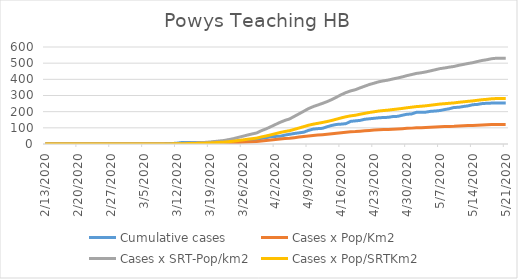
| Category | Cumulative cases | Cases x Pop/Km2 | Cases x SRT-Pop/km2 | Cases x Pop/SRTKm2 |
|---|---|---|---|---|
| 5/21/20 | 253 | 121.25 | 530.532 | 281.176 |
| 5/20/20 | 253 | 121.25 | 530.532 | 281.176 |
| 5/19/20 | 253 | 121.221 | 530.407 | 281.109 |
| 5/18/20 | 253 | 120.556 | 527.499 | 279.568 |
| 5/17/20 | 252 | 119.142 | 521.309 | 276.288 |
| 5/16/20 | 250 | 118.088 | 516.698 | 273.844 |
| 5/15/20 | 245 | 116.607 | 510.218 | 270.409 |
| 5/14/20 | 243 | 114.964 | 503.031 | 266.6 |
| 5/13/20 | 236 | 113.825 | 498.046 | 263.958 |
| 5/12/20 | 232 | 112.515 | 492.313 | 260.92 |
| 5/11/20 | 227 | 111.214 | 486.622 | 257.904 |
| 5/10/20 | 226 | 109.6 | 479.56 | 254.161 |
| 5/9/20 | 218 | 108.66 | 475.447 | 251.981 |
| 5/8/20 | 213 | 107.483 | 470.296 | 249.251 |
| 5/7/20 | 207 | 106.534 | 466.142 | 247.05 |
| 5/6/20 | 204 | 104.967 | 459.287 | 243.417 |
| 5/5/20 | 202 | 103.401 | 452.433 | 239.784 |
| 5/4/20 | 197 | 101.891 | 445.828 | 236.283 |
| 5/3/20 | 196 | 100.676 | 440.51 | 233.465 |
| 5/2/20 | 196 | 99.783 | 436.605 | 231.396 |
| 5/1/20 | 186 | 98.198 | 429.668 | 227.719 |
| 4/30/20 | 184 | 96.698 | 423.104 | 224.24 |
| 4/29/20 | 178 | 94.875 | 415.128 | 220.013 |
| 4/28/20 | 171 | 93.327 | 408.357 | 216.424 |
| 4/27/20 | 170 | 91.941 | 402.292 | 213.21 |
| 4/26/20 | 165 | 90.384 | 395.479 | 209.599 |
| 4/25/20 | 164 | 89.254 | 390.535 | 206.979 |
| 4/24/20 | 162 | 87.973 | 384.927 | 204.007 |
| 4/23/20 | 159 | 86.007 | 376.328 | 199.449 |
| 4/22/20 | 156 | 84.128 | 368.103 | 195.09 |
| 4/21/20 | 153 | 81.744 | 357.676 | 189.564 |
| 4/20/20 | 146 | 79.342 | 347.166 | 183.994 |
| 4/19/20 | 143 | 76.732 | 335.742 | 177.939 |
| 4/18/20 | 140 | 75.042 | 328.347 | 174.02 |
| 4/17/20 | 126 | 72.735 | 318.253 | 168.67 |
| 4/16/20 | 123 | 69.677 | 304.876 | 161.581 |
| 4/15/20 | 121 | 66.269 | 289.962 | 153.677 |
| 4/14/20 | 115 | 62.899 | 275.215 | 145.861 |
| 4/13/20 | 107 | 59.955 | 262.337 | 139.036 |
| 4/12/20 | 97 | 57.421 | 251.245 | 133.157 |
| 4/11/20 | 95 | 55.113 | 241.151 | 127.807 |
| 4/10/20 | 92 | 52.797 | 231.015 | 122.435 |
| 4/9/20 | 84 | 49.949 | 218.552 | 115.83 |
| 4/8/20 | 73 | 46.246 | 202.351 | 107.243 |
| 4/7/20 | 69 | 42.61 | 186.44 | 98.811 |
| 4/6/20 | 65 | 39.04 | 170.82 | 90.533 |
| 4/5/20 | 60 | 35.442 | 155.076 | 82.188 |
| 4/4/20 | 55 | 33.343 | 145.895 | 77.323 |
| 4/3/20 | 48 | 30.676 | 134.222 | 71.136 |
| 4/2/20 | 47 | 27.599 | 120.762 | 64.003 |
| 4/1/20 | 45 | 24.438 | 106.929 | 56.671 |
| 3/31/20 | 39 | 21.4 | 93.635 | 49.626 |
| 3/30/20 | 35 | 18.827 | 82.378 | 43.659 |
| 3/29/20 | 25 | 15.656 | 68.503 | 36.306 |
| 3/28/20 | 22 | 14.175 | 62.022 | 32.871 |
| 3/27/20 | 21 | 12.599 | 55.126 | 29.216 |
| 3/26/20 | 20 | 10.842 | 47.441 | 25.143 |
| 3/25/20 | 18 | 9.19 | 40.213 | 21.312 |
| 3/24/20 | 16 | 7.453 | 32.61 | 17.283 |
| 3/23/20 | 13 | 6.171 | 27.002 | 14.311 |
| 3/22/20 | 11 | 4.937 | 21.602 | 11.449 |
| 3/21/20 | 11 | 4.215 | 18.445 | 9.775 |
| 3/20/20 | 11 | 3.503 | 15.329 | 8.124 |
| 3/19/20 | 9 | 2.82 | 12.338 | 6.539 |
| 3/18/20 | 9 | 2.25 | 9.845 | 5.218 |
| 3/17/20 | 9 | 1.918 | 8.391 | 4.447 |
| 3/16/20 | 9 | 1.567 | 6.854 | 3.633 |
| 3/15/20 | 9 | 1.244 | 5.442 | 2.884 |
| 3/14/20 | 9 | 0.968 | 4.237 | 2.246 |
| 3/13/20 | 9 | 0.788 | 3.448 | 1.827 |
| 3/12/20 | 5 | 0.532 | 2.326 | 1.233 |
| 3/11/20 | 3 | 0.304 | 1.329 | 0.705 |
| 3/10/20 | 2 | 0.171 | 0.748 | 0.396 |
| 3/9/20 | 0 | 0.066 | 0.291 | 0.154 |
| 3/8/20 | 0 | 0.038 | 0.166 | 0.088 |
| 3/7/20 | 0 | 0.038 | 0.166 | 0.088 |
| 3/6/20 | 0 | 0.019 | 0.083 | 0.044 |
| 3/5/20 | 0 | 0.019 | 0.083 | 0.044 |
| 3/4/20 | 0 | 0.019 | 0.083 | 0.044 |
| 3/3/20 | 0 | 0.009 | 0.042 | 0.022 |
| 3/2/20 | 0 | 0.009 | 0.042 | 0.022 |
| 3/1/20 | 0 | 0.009 | 0.042 | 0.022 |
| 2/29/20 | 0 | 0.009 | 0.042 | 0.022 |
| 2/28/20 | 0 | 0.009 | 0.042 | 0.022 |
| 2/27/20 | 0 | 0.009 | 0.042 | 0.022 |
| 2/26/20 | 0 | 0 | 0 | 0 |
| 2/25/20 | 0 | 0 | 0 | 0 |
| 2/24/20 | 0 | 0 | 0 | 0 |
| 2/23/20 | 0 | 0 | 0 | 0 |
| 2/22/20 | 0 | 0 | 0 | 0 |
| 2/21/20 | 0 | 0 | 0 | 0 |
| 2/20/20 | 0 | 0 | 0 | 0 |
| 2/19/20 | 0 | 0 | 0 | 0 |
| 2/18/20 | 0 | 0 | 0 | 0 |
| 2/17/20 | 0 | 0 | 0 | 0 |
| 2/16/20 | 0 | 0 | 0 | 0 |
| 2/15/20 | 0 | 0 | 0 | 0 |
| 2/14/20 | 0 | 0 | 0 | 0 |
| 2/13/20 | 0 | 0 | 0 | 0 |